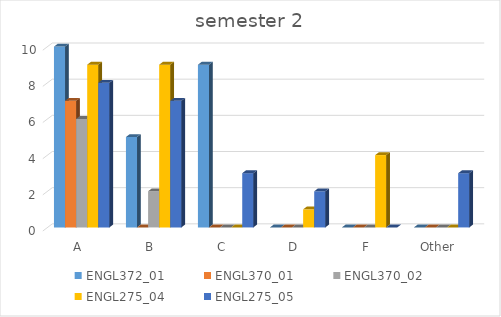
| Category | ENGL372_01 | ENGL370_01 | ENGL370_02 | ENGL275_04 | ENGL275_05 |
|---|---|---|---|---|---|
| A | 10 | 7 | 6 | 9 | 8 |
| B | 5 | 0 | 2 | 9 | 7 |
| C | 9 | 0 | 0 | 0 | 3 |
| D | 0 | 0 | 0 | 1 | 2 |
| F | 0 | 0 | 0 | 4 | 0 |
| Other | 0 | 0 | 0 | 0 | 3 |